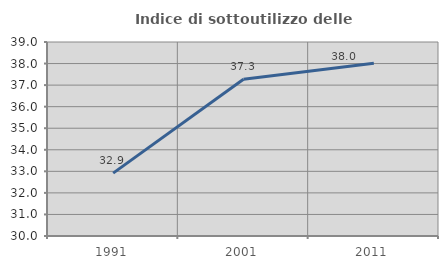
| Category | Indice di sottoutilizzo delle abitazioni  |
|---|---|
| 1991.0 | 32.917 |
| 2001.0 | 37.274 |
| 2011.0 | 38.01 |